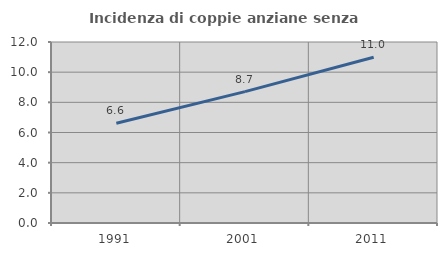
| Category | Incidenza di coppie anziane senza figli  |
|---|---|
| 1991.0 | 6.608 |
| 2001.0 | 8.712 |
| 2011.0 | 10.985 |